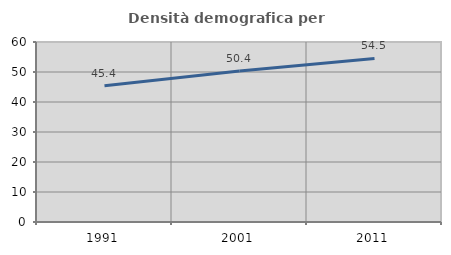
| Category | Densità demografica |
|---|---|
| 1991.0 | 45.431 |
| 2001.0 | 50.363 |
| 2011.0 | 54.517 |